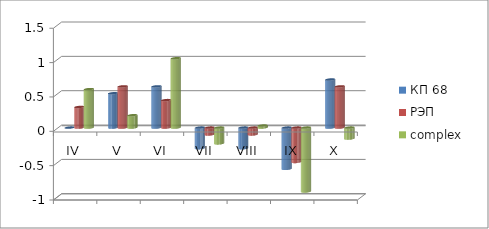
| Category | КП 68 | РЭП  | complex |
|---|---|---|---|
| IV | 0 | 0.3 | 0.56 |
| V | 0.5 | 0.6 | 0.18 |
| VI | 0.6 | 0.4 | 1.01 |
| VII | -0.3 | -0.1 | -0.23 |
| VIII | -0.3 | -0.1 | 0.03 |
| IX | -0.6 | -0.5 | -0.93 |
| X | 0.7 | 0.6 | -0.16 |